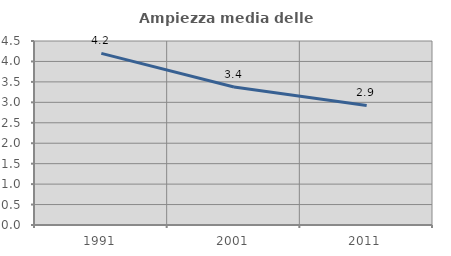
| Category | Ampiezza media delle famiglie |
|---|---|
| 1991.0 | 4.197 |
| 2001.0 | 3.374 |
| 2011.0 | 2.924 |